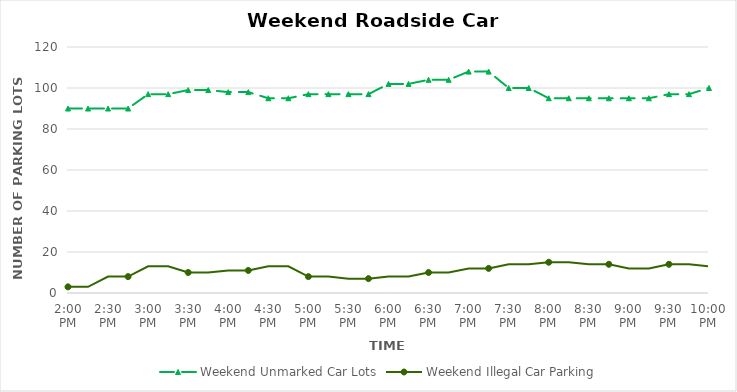
| Category | Weekend Unmarked Car Lots | Weekend Illegal Car Parking |
|---|---|---|
| 0.5833333333333334 | 90 | 3 |
| 0.59375 | 90 | 3 |
| 0.604166666666667 | 90 | 8 |
| 0.614583333333334 | 90 | 8 |
| 0.625 | 97 | 13 |
| 0.635416666666667 | 97 | 13 |
| 0.645833333333334 | 99 | 10 |
| 0.656250000000001 | 99 | 10 |
| 0.666666666666667 | 98 | 11 |
| 0.677083333333334 | 98 | 11 |
| 0.687500000000001 | 95 | 13 |
| 0.697916666666668 | 95 | 13 |
| 0.708333333333335 | 97 | 8 |
| 0.718750000000001 | 97 | 8 |
| 0.729166666666668 | 97 | 7 |
| 0.739583333333335 | 97 | 7 |
| 0.750000000000002 | 102 | 8 |
| 0.760416666666668 | 102 | 8 |
| 0.770833333333335 | 104 | 10 |
| 0.781250000000002 | 104 | 10 |
| 0.791666666666669 | 108 | 12 |
| 0.802083333333335 | 108 | 12 |
| 0.812500000000002 | 100 | 14 |
| 0.822916666666669 | 100 | 14 |
| 0.833333333333336 | 95 | 15 |
| 0.843750000000002 | 95 | 15 |
| 0.854166666666669 | 95 | 14 |
| 0.864583333333336 | 95 | 14 |
| 0.875000000000002 | 95 | 12 |
| 0.885416666666669 | 95 | 12 |
| 0.895833333333336 | 97 | 14 |
| 0.906250000000003 | 97 | 14 |
| 0.916666666666669 | 100 | 13 |